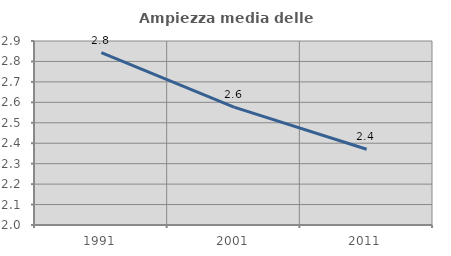
| Category | Ampiezza media delle famiglie |
|---|---|
| 1991.0 | 2.843 |
| 2001.0 | 2.577 |
| 2011.0 | 2.37 |